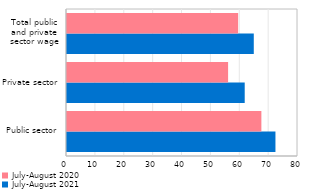
| Category | July-August 2021 | July-August 2020 |
|---|---|---|
| Public sector | 72.189 | 67.318 |
| Private sector | 61.546 | 55.79 |
| Total public
and private
sector wage | 64.685 | 59.271 |